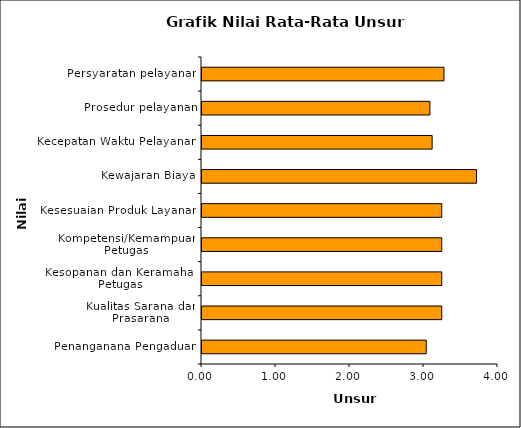
| Category | Series 0 |
|---|---|
| Penanganana Pengaduan | 3.03 |
| Kualitas Sarana dan Prasarana | 3.24 |
| Kesopanan dan Keramahan Petugas | 3.24 |
| Kompetensi/Kemampuan Petugas | 3.24 |
| Kesesuaian Produk Layanan | 3.24 |
| Kewajaran Biaya | 3.71 |
| Kecepatan Waktu Pelayanan | 3.11 |
| Prosedur pelayanan | 3.08 |
| Persyaratan pelayanan | 3.27 |